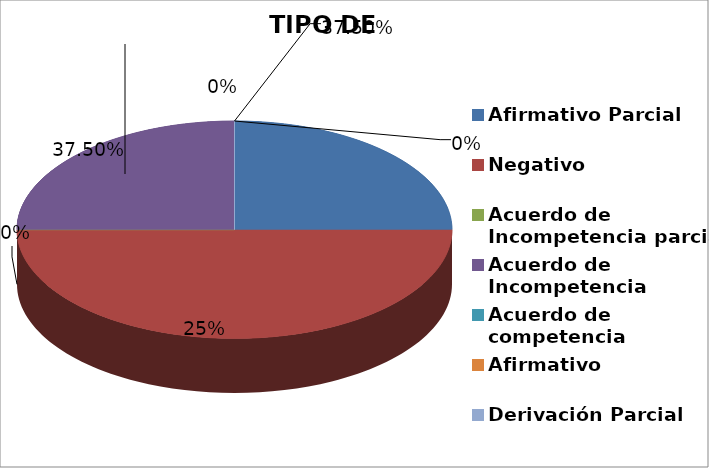
| Category | Series 0 |
|---|---|
| Afirmativo Parcial | 2 |
| Negativo | 4 |
| Acuerdo de Incompetencia parcial | 0 |
| Acuerdo de Incompetencia | 2 |
| Acuerdo de competencia | 0 |
| Afirmativo | 0 |
| Derivación Parcial | 0 |